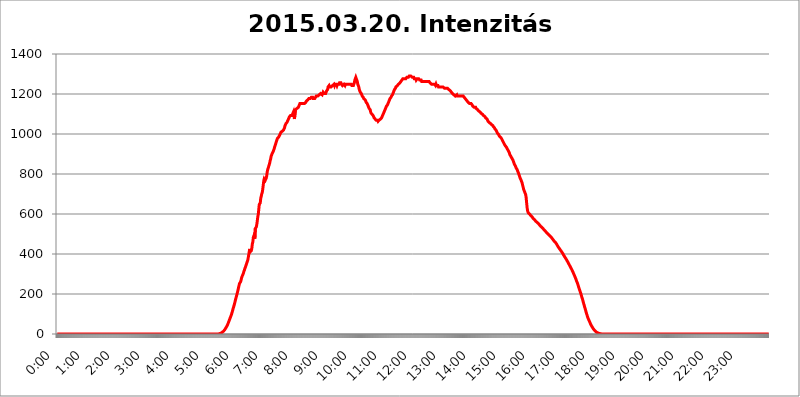
| Category | 2015.03.20. Intenzitás [W/m^2] |
|---|---|
| 0.0 | -0.256 |
| 0.0006944444444444445 | -0.256 |
| 0.001388888888888889 | -0.256 |
| 0.0020833333333333333 | -0.256 |
| 0.002777777777777778 | -0.256 |
| 0.003472222222222222 | -0.256 |
| 0.004166666666666667 | -0.256 |
| 0.004861111111111111 | -0.256 |
| 0.005555555555555556 | -0.256 |
| 0.0062499999999999995 | -0.256 |
| 0.006944444444444444 | -0.256 |
| 0.007638888888888889 | -0.256 |
| 0.008333333333333333 | -0.256 |
| 0.009027777777777779 | -0.256 |
| 0.009722222222222222 | -0.256 |
| 0.010416666666666666 | -0.256 |
| 0.011111111111111112 | -0.256 |
| 0.011805555555555555 | -0.256 |
| 0.012499999999999999 | -0.256 |
| 0.013194444444444444 | -0.256 |
| 0.013888888888888888 | -0.256 |
| 0.014583333333333332 | -0.256 |
| 0.015277777777777777 | -0.256 |
| 0.015972222222222224 | -0.256 |
| 0.016666666666666666 | -0.256 |
| 0.017361111111111112 | -0.256 |
| 0.018055555555555557 | -0.256 |
| 0.01875 | -0.256 |
| 0.019444444444444445 | -0.256 |
| 0.02013888888888889 | -0.256 |
| 0.020833333333333332 | -0.256 |
| 0.02152777777777778 | -0.256 |
| 0.022222222222222223 | -0.256 |
| 0.02291666666666667 | -0.256 |
| 0.02361111111111111 | -0.256 |
| 0.024305555555555556 | -0.256 |
| 0.024999999999999998 | -0.256 |
| 0.025694444444444447 | -0.256 |
| 0.02638888888888889 | -0.256 |
| 0.027083333333333334 | -0.256 |
| 0.027777777777777776 | -0.256 |
| 0.02847222222222222 | -0.256 |
| 0.029166666666666664 | -0.256 |
| 0.029861111111111113 | -0.256 |
| 0.030555555555555555 | -0.256 |
| 0.03125 | -0.256 |
| 0.03194444444444445 | -0.256 |
| 0.03263888888888889 | -0.256 |
| 0.03333333333333333 | -0.256 |
| 0.034027777777777775 | -0.256 |
| 0.034722222222222224 | -0.256 |
| 0.035416666666666666 | -0.256 |
| 0.036111111111111115 | -0.256 |
| 0.03680555555555556 | -0.256 |
| 0.0375 | -0.256 |
| 0.03819444444444444 | -0.256 |
| 0.03888888888888889 | -0.256 |
| 0.03958333333333333 | -0.256 |
| 0.04027777777777778 | -0.256 |
| 0.04097222222222222 | -0.256 |
| 0.041666666666666664 | -0.256 |
| 0.042361111111111106 | -0.256 |
| 0.04305555555555556 | -0.256 |
| 0.043750000000000004 | -0.256 |
| 0.044444444444444446 | -0.256 |
| 0.04513888888888889 | -0.256 |
| 0.04583333333333334 | -0.256 |
| 0.04652777777777778 | -0.256 |
| 0.04722222222222222 | -0.256 |
| 0.04791666666666666 | -0.256 |
| 0.04861111111111111 | -0.256 |
| 0.049305555555555554 | -0.256 |
| 0.049999999999999996 | -0.256 |
| 0.05069444444444445 | -0.256 |
| 0.051388888888888894 | -0.256 |
| 0.052083333333333336 | -0.256 |
| 0.05277777777777778 | -0.256 |
| 0.05347222222222222 | -0.256 |
| 0.05416666666666667 | -0.256 |
| 0.05486111111111111 | -0.256 |
| 0.05555555555555555 | -0.256 |
| 0.05625 | -0.256 |
| 0.05694444444444444 | -0.256 |
| 0.057638888888888885 | -0.256 |
| 0.05833333333333333 | -0.256 |
| 0.05902777777777778 | -0.256 |
| 0.059722222222222225 | -0.256 |
| 0.06041666666666667 | -0.256 |
| 0.061111111111111116 | -0.256 |
| 0.06180555555555556 | -0.256 |
| 0.0625 | -0.256 |
| 0.06319444444444444 | -0.256 |
| 0.06388888888888888 | -0.256 |
| 0.06458333333333334 | -0.256 |
| 0.06527777777777778 | -0.256 |
| 0.06597222222222222 | -0.256 |
| 0.06666666666666667 | -0.256 |
| 0.06736111111111111 | -0.256 |
| 0.06805555555555555 | -0.256 |
| 0.06874999999999999 | -0.256 |
| 0.06944444444444443 | -0.256 |
| 0.07013888888888889 | -0.256 |
| 0.07083333333333333 | -0.256 |
| 0.07152777777777779 | -0.256 |
| 0.07222222222222223 | -0.256 |
| 0.07291666666666667 | -0.256 |
| 0.07361111111111111 | -0.256 |
| 0.07430555555555556 | -0.256 |
| 0.075 | -0.256 |
| 0.07569444444444444 | -0.256 |
| 0.0763888888888889 | -0.256 |
| 0.07708333333333334 | -0.256 |
| 0.07777777777777778 | -0.256 |
| 0.07847222222222222 | -0.256 |
| 0.07916666666666666 | -0.256 |
| 0.0798611111111111 | -0.256 |
| 0.08055555555555556 | -0.256 |
| 0.08125 | -0.256 |
| 0.08194444444444444 | -0.256 |
| 0.08263888888888889 | -0.256 |
| 0.08333333333333333 | -0.256 |
| 0.08402777777777777 | -0.256 |
| 0.08472222222222221 | -0.256 |
| 0.08541666666666665 | -0.256 |
| 0.08611111111111112 | -0.256 |
| 0.08680555555555557 | -0.256 |
| 0.08750000000000001 | -0.256 |
| 0.08819444444444445 | -0.256 |
| 0.08888888888888889 | -0.256 |
| 0.08958333333333333 | -0.256 |
| 0.09027777777777778 | -0.256 |
| 0.09097222222222222 | -0.256 |
| 0.09166666666666667 | -0.256 |
| 0.09236111111111112 | -0.256 |
| 0.09305555555555556 | -0.256 |
| 0.09375 | -0.256 |
| 0.09444444444444444 | -0.256 |
| 0.09513888888888888 | -0.256 |
| 0.09583333333333333 | -0.256 |
| 0.09652777777777777 | -0.256 |
| 0.09722222222222222 | -0.256 |
| 0.09791666666666667 | -0.256 |
| 0.09861111111111111 | -0.256 |
| 0.09930555555555555 | -0.256 |
| 0.09999999999999999 | -0.256 |
| 0.10069444444444443 | -0.256 |
| 0.1013888888888889 | -0.256 |
| 0.10208333333333335 | -0.256 |
| 0.10277777777777779 | -0.256 |
| 0.10347222222222223 | -0.256 |
| 0.10416666666666667 | -0.256 |
| 0.10486111111111111 | -0.256 |
| 0.10555555555555556 | -0.256 |
| 0.10625 | -0.256 |
| 0.10694444444444444 | -0.256 |
| 0.1076388888888889 | -0.256 |
| 0.10833333333333334 | -0.256 |
| 0.10902777777777778 | -0.256 |
| 0.10972222222222222 | -0.256 |
| 0.1111111111111111 | -0.256 |
| 0.11180555555555556 | -0.256 |
| 0.11180555555555556 | -0.256 |
| 0.1125 | -0.256 |
| 0.11319444444444444 | -0.256 |
| 0.11388888888888889 | -0.256 |
| 0.11458333333333333 | -0.256 |
| 0.11527777777777777 | -0.256 |
| 0.11597222222222221 | -0.256 |
| 0.11666666666666665 | -0.256 |
| 0.1173611111111111 | -0.256 |
| 0.11805555555555557 | -0.256 |
| 0.11944444444444445 | -0.256 |
| 0.12013888888888889 | -0.256 |
| 0.12083333333333333 | -0.256 |
| 0.12152777777777778 | -0.256 |
| 0.12222222222222223 | -0.256 |
| 0.12291666666666667 | -0.256 |
| 0.12291666666666667 | -0.256 |
| 0.12361111111111112 | -0.256 |
| 0.12430555555555556 | -0.256 |
| 0.125 | -0.256 |
| 0.12569444444444444 | -0.256 |
| 0.12638888888888888 | -0.256 |
| 0.12708333333333333 | -0.256 |
| 0.16875 | -0.256 |
| 0.12847222222222224 | -0.256 |
| 0.12916666666666668 | -0.256 |
| 0.12986111111111112 | -0.256 |
| 0.13055555555555556 | -0.256 |
| 0.13125 | -0.256 |
| 0.13194444444444445 | -0.256 |
| 0.1326388888888889 | -0.256 |
| 0.13333333333333333 | -0.256 |
| 0.13402777777777777 | -0.256 |
| 0.13402777777777777 | -0.256 |
| 0.13472222222222222 | -0.256 |
| 0.13541666666666666 | -0.256 |
| 0.1361111111111111 | -0.256 |
| 0.13749999999999998 | -0.256 |
| 0.13819444444444443 | -0.256 |
| 0.1388888888888889 | -0.256 |
| 0.13958333333333334 | -0.256 |
| 0.14027777777777778 | -0.256 |
| 0.14097222222222222 | -0.256 |
| 0.14166666666666666 | -0.256 |
| 0.1423611111111111 | -0.256 |
| 0.14305555555555557 | -0.256 |
| 0.14375000000000002 | -0.256 |
| 0.14444444444444446 | -0.256 |
| 0.1451388888888889 | -0.256 |
| 0.1451388888888889 | -0.256 |
| 0.14652777777777778 | -0.256 |
| 0.14722222222222223 | -0.256 |
| 0.14791666666666667 | -0.256 |
| 0.1486111111111111 | -0.256 |
| 0.14930555555555555 | -0.256 |
| 0.15 | -0.256 |
| 0.15069444444444444 | -0.256 |
| 0.15138888888888888 | -0.256 |
| 0.15208333333333332 | -0.256 |
| 0.15277777777777776 | -0.256 |
| 0.15347222222222223 | -0.256 |
| 0.15416666666666667 | -0.256 |
| 0.15486111111111112 | -0.256 |
| 0.15555555555555556 | -0.256 |
| 0.15625 | -0.256 |
| 0.15694444444444444 | -0.256 |
| 0.15763888888888888 | -0.256 |
| 0.15833333333333333 | -0.256 |
| 0.15902777777777777 | -0.256 |
| 0.15972222222222224 | -0.256 |
| 0.16041666666666668 | -0.256 |
| 0.16111111111111112 | -0.256 |
| 0.16180555555555556 | -0.256 |
| 0.1625 | -0.256 |
| 0.16319444444444445 | -0.256 |
| 0.1638888888888889 | -0.256 |
| 0.16458333333333333 | -0.256 |
| 0.16527777777777777 | -0.256 |
| 0.16597222222222222 | -0.256 |
| 0.16666666666666666 | -0.256 |
| 0.1673611111111111 | -0.256 |
| 0.16805555555555554 | -0.256 |
| 0.16874999999999998 | -0.256 |
| 0.16944444444444443 | -0.256 |
| 0.17013888888888887 | -0.256 |
| 0.1708333333333333 | -0.256 |
| 0.17152777777777775 | -0.256 |
| 0.17222222222222225 | -0.256 |
| 0.1729166666666667 | -0.256 |
| 0.17361111111111113 | -0.256 |
| 0.17430555555555557 | -0.256 |
| 0.17500000000000002 | -0.256 |
| 0.17569444444444446 | -0.256 |
| 0.1763888888888889 | -0.256 |
| 0.17708333333333334 | -0.256 |
| 0.17777777777777778 | -0.256 |
| 0.17847222222222223 | -0.256 |
| 0.17916666666666667 | -0.256 |
| 0.1798611111111111 | -0.256 |
| 0.18055555555555555 | -0.256 |
| 0.18125 | -0.256 |
| 0.18194444444444444 | -0.256 |
| 0.1826388888888889 | -0.256 |
| 0.18333333333333335 | -0.256 |
| 0.1840277777777778 | -0.256 |
| 0.18472222222222223 | -0.256 |
| 0.18541666666666667 | -0.256 |
| 0.18611111111111112 | -0.256 |
| 0.18680555555555556 | -0.256 |
| 0.1875 | -0.256 |
| 0.18819444444444444 | -0.256 |
| 0.18888888888888888 | -0.256 |
| 0.18958333333333333 | -0.256 |
| 0.19027777777777777 | -0.256 |
| 0.1909722222222222 | -0.256 |
| 0.19166666666666665 | -0.256 |
| 0.19236111111111112 | -0.256 |
| 0.19305555555555554 | -0.256 |
| 0.19375 | -0.256 |
| 0.19444444444444445 | -0.256 |
| 0.1951388888888889 | -0.256 |
| 0.19583333333333333 | -0.256 |
| 0.19652777777777777 | -0.256 |
| 0.19722222222222222 | -0.256 |
| 0.19791666666666666 | -0.256 |
| 0.1986111111111111 | -0.256 |
| 0.19930555555555554 | -0.256 |
| 0.19999999999999998 | -0.256 |
| 0.20069444444444443 | -0.256 |
| 0.20138888888888887 | -0.256 |
| 0.2020833333333333 | -0.256 |
| 0.2027777777777778 | -0.256 |
| 0.2034722222222222 | -0.256 |
| 0.2041666666666667 | -0.256 |
| 0.20486111111111113 | -0.256 |
| 0.20555555555555557 | -0.256 |
| 0.20625000000000002 | -0.256 |
| 0.20694444444444446 | -0.256 |
| 0.2076388888888889 | -0.256 |
| 0.20833333333333334 | -0.256 |
| 0.20902777777777778 | -0.256 |
| 0.20972222222222223 | -0.256 |
| 0.21041666666666667 | -0.256 |
| 0.2111111111111111 | -0.256 |
| 0.21180555555555555 | -0.256 |
| 0.2125 | -0.256 |
| 0.21319444444444444 | -0.256 |
| 0.2138888888888889 | -0.256 |
| 0.21458333333333335 | -0.256 |
| 0.2152777777777778 | -0.256 |
| 0.21597222222222223 | -0.256 |
| 0.21666666666666667 | -0.256 |
| 0.21736111111111112 | -0.256 |
| 0.21805555555555556 | -0.256 |
| 0.21875 | -0.256 |
| 0.21944444444444444 | -0.256 |
| 0.22013888888888888 | -0.256 |
| 0.22083333333333333 | -0.256 |
| 0.22152777777777777 | -0.256 |
| 0.2222222222222222 | -0.256 |
| 0.22291666666666665 | -0.256 |
| 0.2236111111111111 | -0.256 |
| 0.22430555555555556 | -0.256 |
| 0.225 | -0.256 |
| 0.22569444444444445 | 1.09 |
| 0.2263888888888889 | 1.09 |
| 0.22708333333333333 | 1.09 |
| 0.22777777777777777 | 2.439 |
| 0.22847222222222222 | 3.791 |
| 0.22916666666666666 | 3.791 |
| 0.2298611111111111 | 5.146 |
| 0.23055555555555554 | 6.503 |
| 0.23124999999999998 | 7.862 |
| 0.23194444444444443 | 10.589 |
| 0.23263888888888887 | 11.956 |
| 0.2333333333333333 | 14.696 |
| 0.2340277777777778 | 17.444 |
| 0.2347222222222222 | 20.201 |
| 0.2354166666666667 | 24.35 |
| 0.23611111111111113 | 28.514 |
| 0.23680555555555557 | 31.297 |
| 0.23750000000000002 | 36.881 |
| 0.23819444444444446 | 41.081 |
| 0.2388888888888889 | 46.695 |
| 0.23958333333333334 | 52.322 |
| 0.24027777777777778 | 59.368 |
| 0.24097222222222223 | 65.012 |
| 0.24166666666666667 | 72.069 |
| 0.2423611111111111 | 79.125 |
| 0.24305555555555555 | 84.766 |
| 0.24375 | 91.806 |
| 0.24444444444444446 | 98.83 |
| 0.24513888888888888 | 107.232 |
| 0.24583333333333335 | 115.598 |
| 0.2465277777777778 | 125.304 |
| 0.24722222222222223 | 133.57 |
| 0.24791666666666667 | 141.782 |
| 0.24861111111111112 | 151.286 |
| 0.24930555555555556 | 160.704 |
| 0.25 | 171.353 |
| 0.25069444444444444 | 180.569 |
| 0.2513888888888889 | 189.685 |
| 0.2520833333333333 | 198.701 |
| 0.25277777777777777 | 208.881 |
| 0.2534722222222222 | 218.93 |
| 0.25416666666666665 | 230.083 |
| 0.2548611111111111 | 241.083 |
| 0.2555555555555556 | 251.939 |
| 0.25625000000000003 | 256.722 |
| 0.2569444444444445 | 260.293 |
| 0.2576388888888889 | 266.216 |
| 0.25833333333333336 | 277.967 |
| 0.2590277777777778 | 286.13 |
| 0.25972222222222224 | 291.937 |
| 0.2604166666666667 | 297.728 |
| 0.2611111111111111 | 304.664 |
| 0.26180555555555557 | 312.749 |
| 0.2625 | 319.683 |
| 0.26319444444444445 | 327.793 |
| 0.2638888888888889 | 333.608 |
| 0.26458333333333334 | 341.794 |
| 0.2652777777777778 | 348.865 |
| 0.2659722222222222 | 355.999 |
| 0.26666666666666666 | 363.212 |
| 0.2673611111111111 | 371.742 |
| 0.26805555555555555 | 385.455 |
| 0.26875 | 399.628 |
| 0.26944444444444443 | 415.735 |
| 0.2701388888888889 | 425.497 |
| 0.2708333333333333 | 411.638 |
| 0.27152777777777776 | 408.934 |
| 0.2722222222222222 | 417.112 |
| 0.27291666666666664 | 428.341 |
| 0.2736111111111111 | 450.542 |
| 0.2743055555555555 | 459.898 |
| 0.27499999999999997 | 482.945 |
| 0.27569444444444446 | 489.873 |
| 0.27638888888888885 | 484.662 |
| 0.27708333333333335 | 476.176 |
| 0.2777777777777778 | 527.122 |
| 0.27847222222222223 | 523.186 |
| 0.2791666666666667 | 535.145 |
| 0.2798611111111111 | 547.572 |
| 0.28055555555555556 | 564.917 |
| 0.28125 | 585.562 |
| 0.28194444444444444 | 597.582 |
| 0.2826388888888889 | 622.881 |
| 0.2833333333333333 | 647.179 |
| 0.28402777777777777 | 647.179 |
| 0.2847222222222222 | 655.618 |
| 0.28541666666666665 | 678.997 |
| 0.28611111111111115 | 688.102 |
| 0.28680555555555554 | 700.54 |
| 0.28750000000000003 | 706.89 |
| 0.2881944444444445 | 723.153 |
| 0.2888888888888889 | 743.425 |
| 0.28958333333333336 | 764.555 |
| 0.2902777777777778 | 775.451 |
| 0.29097222222222224 | 775.451 |
| 0.2916666666666667 | 768.162 |
| 0.2923611111111111 | 771.794 |
| 0.29305555555555557 | 779.134 |
| 0.29375 | 790.334 |
| 0.29444444444444445 | 809.522 |
| 0.2951388888888889 | 821.353 |
| 0.29583333333333334 | 829.377 |
| 0.2965277777777778 | 837.51 |
| 0.2972222222222222 | 841.619 |
| 0.29791666666666666 | 854.113 |
| 0.2986111111111111 | 866.865 |
| 0.29930555555555555 | 875.511 |
| 0.3 | 888.701 |
| 0.30069444444444443 | 893.157 |
| 0.3013888888888889 | 902.16 |
| 0.3020833333333333 | 902.16 |
| 0.30277777777777776 | 911.285 |
| 0.3034722222222222 | 915.893 |
| 0.30416666666666664 | 925.203 |
| 0.3048611111111111 | 934.639 |
| 0.3055555555555555 | 939.404 |
| 0.30624999999999997 | 949.03 |
| 0.3069444444444444 | 958.785 |
| 0.3076388888888889 | 963.712 |
| 0.30833333333333335 | 973.663 |
| 0.3090277777777778 | 978.688 |
| 0.30972222222222223 | 978.688 |
| 0.3104166666666667 | 983.747 |
| 0.3111111111111111 | 988.839 |
| 0.31180555555555556 | 993.965 |
| 0.3125 | 999.125 |
| 0.31319444444444444 | 1004.318 |
| 0.3138888888888889 | 1009.546 |
| 0.3145833333333333 | 1009.546 |
| 0.31527777777777777 | 1009.546 |
| 0.3159722222222222 | 1014.809 |
| 0.31666666666666665 | 1014.809 |
| 0.31736111111111115 | 1020.106 |
| 0.31805555555555554 | 1025.437 |
| 0.31875000000000003 | 1030.804 |
| 0.3194444444444445 | 1041.644 |
| 0.3201388888888889 | 1047.117 |
| 0.32083333333333336 | 1052.625 |
| 0.3215277777777778 | 1052.625 |
| 0.32222222222222224 | 1058.17 |
| 0.3229166666666667 | 1058.17 |
| 0.3236111111111111 | 1069.368 |
| 0.32430555555555557 | 1075.021 |
| 0.325 | 1075.021 |
| 0.32569444444444445 | 1086.439 |
| 0.3263888888888889 | 1086.439 |
| 0.32708333333333334 | 1092.203 |
| 0.3277777777777778 | 1092.203 |
| 0.3284722222222222 | 1092.203 |
| 0.32916666666666666 | 1092.203 |
| 0.3298611111111111 | 1098.004 |
| 0.33055555555555555 | 1098.004 |
| 0.33125 | 1109.72 |
| 0.33194444444444443 | 1109.72 |
| 0.3326388888888889 | 1075.021 |
| 0.3333333333333333 | 1075.021 |
| 0.3340277777777778 | 1121.587 |
| 0.3347222222222222 | 1121.587 |
| 0.3354166666666667 | 1121.587 |
| 0.3361111111111111 | 1127.578 |
| 0.3368055555555556 | 1127.578 |
| 0.33749999999999997 | 1127.578 |
| 0.33819444444444446 | 1133.607 |
| 0.33888888888888885 | 1139.675 |
| 0.33958333333333335 | 1145.782 |
| 0.34027777777777773 | 1151.928 |
| 0.34097222222222223 | 1151.928 |
| 0.3416666666666666 | 1151.928 |
| 0.3423611111111111 | 1151.928 |
| 0.3430555555555555 | 1151.928 |
| 0.34375 | 1151.928 |
| 0.3444444444444445 | 1151.928 |
| 0.3451388888888889 | 1151.928 |
| 0.3458333333333334 | 1151.928 |
| 0.34652777777777777 | 1151.928 |
| 0.34722222222222227 | 1151.928 |
| 0.34791666666666665 | 1151.928 |
| 0.34861111111111115 | 1158.113 |
| 0.34930555555555554 | 1164.337 |
| 0.35000000000000003 | 1164.337 |
| 0.3506944444444444 | 1164.337 |
| 0.3513888888888889 | 1170.601 |
| 0.3520833333333333 | 1170.601 |
| 0.3527777777777778 | 1176.905 |
| 0.3534722222222222 | 1176.905 |
| 0.3541666666666667 | 1176.905 |
| 0.3548611111111111 | 1176.905 |
| 0.35555555555555557 | 1176.905 |
| 0.35625 | 1183.249 |
| 0.35694444444444445 | 1183.249 |
| 0.3576388888888889 | 1183.249 |
| 0.35833333333333334 | 1183.249 |
| 0.3590277777777778 | 1176.905 |
| 0.3597222222222222 | 1176.905 |
| 0.36041666666666666 | 1176.905 |
| 0.3611111111111111 | 1176.905 |
| 0.36180555555555555 | 1176.905 |
| 0.3625 | 1176.905 |
| 0.36319444444444443 | 1189.633 |
| 0.3638888888888889 | 1189.633 |
| 0.3645833333333333 | 1189.633 |
| 0.3652777777777778 | 1189.633 |
| 0.3659722222222222 | 1189.633 |
| 0.3666666666666667 | 1189.633 |
| 0.3673611111111111 | 1196.058 |
| 0.3680555555555556 | 1196.058 |
| 0.36874999999999997 | 1196.058 |
| 0.36944444444444446 | 1202.523 |
| 0.37013888888888885 | 1202.523 |
| 0.37083333333333335 | 1202.523 |
| 0.37152777777777773 | 1196.058 |
| 0.37222222222222223 | 1202.523 |
| 0.3729166666666666 | 1209.029 |
| 0.3736111111111111 | 1209.029 |
| 0.3743055555555555 | 1202.523 |
| 0.375 | 1202.523 |
| 0.3756944444444445 | 1202.523 |
| 0.3763888888888889 | 1202.523 |
| 0.3770833333333334 | 1209.029 |
| 0.37777777777777777 | 1215.576 |
| 0.37847222222222227 | 1215.576 |
| 0.37916666666666665 | 1222.164 |
| 0.37986111111111115 | 1235.465 |
| 0.38055555555555554 | 1235.465 |
| 0.38125000000000003 | 1242.179 |
| 0.3819444444444444 | 1235.465 |
| 0.3826388888888889 | 1235.465 |
| 0.3833333333333333 | 1235.465 |
| 0.3840277777777778 | 1235.465 |
| 0.3847222222222222 | 1235.465 |
| 0.3854166666666667 | 1235.465 |
| 0.3861111111111111 | 1242.179 |
| 0.38680555555555557 | 1242.179 |
| 0.3875 | 1242.179 |
| 0.38819444444444445 | 1248.934 |
| 0.3888888888888889 | 1242.179 |
| 0.38958333333333334 | 1248.934 |
| 0.3902777777777778 | 1248.934 |
| 0.3909722222222222 | 1248.934 |
| 0.39166666666666666 | 1248.934 |
| 0.3923611111111111 | 1242.179 |
| 0.39305555555555555 | 1248.934 |
| 0.39375 | 1248.934 |
| 0.39444444444444443 | 1248.934 |
| 0.3951388888888889 | 1248.934 |
| 0.3958333333333333 | 1255.731 |
| 0.3965277777777778 | 1255.731 |
| 0.3972222222222222 | 1255.731 |
| 0.3979166666666667 | 1255.731 |
| 0.3986111111111111 | 1248.934 |
| 0.3993055555555556 | 1248.934 |
| 0.39999999999999997 | 1242.179 |
| 0.40069444444444446 | 1242.179 |
| 0.40138888888888885 | 1242.179 |
| 0.40208333333333335 | 1248.934 |
| 0.40277777777777773 | 1248.934 |
| 0.40347222222222223 | 1242.179 |
| 0.4041666666666666 | 1248.934 |
| 0.4048611111111111 | 1248.934 |
| 0.4055555555555555 | 1248.934 |
| 0.40625 | 1248.934 |
| 0.4069444444444445 | 1248.934 |
| 0.4076388888888889 | 1248.934 |
| 0.4083333333333334 | 1248.934 |
| 0.40902777777777777 | 1248.934 |
| 0.40972222222222227 | 1248.934 |
| 0.41041666666666665 | 1248.934 |
| 0.41111111111111115 | 1248.934 |
| 0.41180555555555554 | 1248.934 |
| 0.41250000000000003 | 1248.934 |
| 0.4131944444444444 | 1242.179 |
| 0.4138888888888889 | 1242.179 |
| 0.4145833333333333 | 1242.179 |
| 0.4152777777777778 | 1242.179 |
| 0.4159722222222222 | 1248.934 |
| 0.4166666666666667 | 1255.731 |
| 0.4173611111111111 | 1269.454 |
| 0.41805555555555557 | 1276.38 |
| 0.41875 | 1283.348 |
| 0.41944444444444445 | 1283.348 |
| 0.4201388888888889 | 1269.454 |
| 0.42083333333333334 | 1262.571 |
| 0.4215277777777778 | 1248.934 |
| 0.4222222222222222 | 1242.179 |
| 0.42291666666666666 | 1235.465 |
| 0.4236111111111111 | 1222.164 |
| 0.42430555555555555 | 1222.164 |
| 0.425 | 1209.029 |
| 0.42569444444444443 | 1209.029 |
| 0.4263888888888889 | 1202.523 |
| 0.4270833333333333 | 1196.058 |
| 0.4277777777777778 | 1189.633 |
| 0.4284722222222222 | 1189.633 |
| 0.4291666666666667 | 1183.249 |
| 0.4298611111111111 | 1176.905 |
| 0.4305555555555556 | 1176.905 |
| 0.43124999999999997 | 1176.905 |
| 0.43194444444444446 | 1170.601 |
| 0.43263888888888885 | 1164.337 |
| 0.43333333333333335 | 1158.113 |
| 0.43402777777777773 | 1158.113 |
| 0.43472222222222223 | 1151.928 |
| 0.4354166666666666 | 1145.782 |
| 0.4361111111111111 | 1139.675 |
| 0.4368055555555555 | 1139.675 |
| 0.4375 | 1127.578 |
| 0.4381944444444445 | 1127.578 |
| 0.4388888888888889 | 1121.587 |
| 0.4395833333333334 | 1109.72 |
| 0.44027777777777777 | 1103.843 |
| 0.44097222222222227 | 1103.843 |
| 0.44166666666666665 | 1098.004 |
| 0.44236111111111115 | 1098.004 |
| 0.44305555555555554 | 1092.203 |
| 0.44375000000000003 | 1086.439 |
| 0.4444444444444444 | 1080.711 |
| 0.4451388888888889 | 1080.711 |
| 0.4458333333333333 | 1075.021 |
| 0.4465277777777778 | 1075.021 |
| 0.4472222222222222 | 1069.368 |
| 0.4479166666666667 | 1069.368 |
| 0.4486111111111111 | 1069.368 |
| 0.44930555555555557 | 1069.368 |
| 0.45 | 1063.751 |
| 0.45069444444444445 | 1063.751 |
| 0.4513888888888889 | 1069.368 |
| 0.45208333333333334 | 1069.368 |
| 0.4527777777777778 | 1069.368 |
| 0.4534722222222222 | 1075.021 |
| 0.45416666666666666 | 1075.021 |
| 0.4548611111111111 | 1080.711 |
| 0.45555555555555555 | 1086.439 |
| 0.45625 | 1092.203 |
| 0.45694444444444443 | 1098.004 |
| 0.4576388888888889 | 1103.843 |
| 0.4583333333333333 | 1109.72 |
| 0.4590277777777778 | 1115.634 |
| 0.4597222222222222 | 1121.587 |
| 0.4604166666666667 | 1127.578 |
| 0.4611111111111111 | 1133.607 |
| 0.4618055555555556 | 1139.675 |
| 0.46249999999999997 | 1139.675 |
| 0.46319444444444446 | 1145.782 |
| 0.46388888888888885 | 1151.928 |
| 0.46458333333333335 | 1158.113 |
| 0.46527777777777773 | 1164.337 |
| 0.46597222222222223 | 1170.601 |
| 0.4666666666666666 | 1176.905 |
| 0.4673611111111111 | 1176.905 |
| 0.4680555555555555 | 1183.249 |
| 0.46875 | 1189.633 |
| 0.4694444444444445 | 1189.633 |
| 0.4701388888888889 | 1196.058 |
| 0.4708333333333334 | 1202.523 |
| 0.47152777777777777 | 1209.029 |
| 0.47222222222222227 | 1215.576 |
| 0.47291666666666665 | 1222.164 |
| 0.47361111111111115 | 1222.164 |
| 0.47430555555555554 | 1228.794 |
| 0.47500000000000003 | 1235.465 |
| 0.4756944444444444 | 1235.465 |
| 0.4763888888888889 | 1235.465 |
| 0.4770833333333333 | 1242.179 |
| 0.4777777777777778 | 1242.179 |
| 0.4784722222222222 | 1248.934 |
| 0.4791666666666667 | 1248.934 |
| 0.4798611111111111 | 1248.934 |
| 0.48055555555555557 | 1255.731 |
| 0.48125 | 1255.731 |
| 0.48194444444444445 | 1262.571 |
| 0.4826388888888889 | 1262.571 |
| 0.48333333333333334 | 1269.454 |
| 0.4840277777777778 | 1269.454 |
| 0.4847222222222222 | 1276.38 |
| 0.48541666666666666 | 1276.38 |
| 0.4861111111111111 | 1276.38 |
| 0.48680555555555555 | 1276.38 |
| 0.4875 | 1276.38 |
| 0.48819444444444443 | 1276.38 |
| 0.4888888888888889 | 1276.38 |
| 0.4895833333333333 | 1276.38 |
| 0.4902777777777778 | 1283.348 |
| 0.4909722222222222 | 1283.348 |
| 0.4916666666666667 | 1283.348 |
| 0.4923611111111111 | 1283.348 |
| 0.4930555555555556 | 1283.348 |
| 0.49374999999999997 | 1290.36 |
| 0.49444444444444446 | 1290.36 |
| 0.49513888888888885 | 1290.36 |
| 0.49583333333333335 | 1290.36 |
| 0.49652777777777773 | 1290.36 |
| 0.49722222222222223 | 1290.36 |
| 0.4979166666666666 | 1283.348 |
| 0.4986111111111111 | 1283.348 |
| 0.4993055555555555 | 1283.348 |
| 0.5 | 1283.348 |
| 0.5006944444444444 | 1276.38 |
| 0.5013888888888889 | 1276.38 |
| 0.5020833333333333 | 1276.38 |
| 0.5027777777777778 | 1276.38 |
| 0.5034722222222222 | 1269.454 |
| 0.5041666666666667 | 1269.454 |
| 0.5048611111111111 | 1276.38 |
| 0.5055555555555555 | 1276.38 |
| 0.50625 | 1276.38 |
| 0.5069444444444444 | 1276.38 |
| 0.5076388888888889 | 1276.38 |
| 0.5083333333333333 | 1269.454 |
| 0.5090277777777777 | 1269.454 |
| 0.5097222222222222 | 1269.454 |
| 0.5104166666666666 | 1269.454 |
| 0.5111111111111112 | 1262.571 |
| 0.5118055555555555 | 1262.571 |
| 0.5125000000000001 | 1262.571 |
| 0.5131944444444444 | 1262.571 |
| 0.513888888888889 | 1262.571 |
| 0.5145833333333333 | 1262.571 |
| 0.5152777777777778 | 1262.571 |
| 0.5159722222222222 | 1262.571 |
| 0.5166666666666667 | 1262.571 |
| 0.517361111111111 | 1262.571 |
| 0.5180555555555556 | 1262.571 |
| 0.5187499999999999 | 1262.571 |
| 0.5194444444444445 | 1262.571 |
| 0.5201388888888888 | 1262.571 |
| 0.5208333333333334 | 1262.571 |
| 0.5215277777777778 | 1262.571 |
| 0.5222222222222223 | 1262.571 |
| 0.5229166666666667 | 1255.731 |
| 0.5236111111111111 | 1255.731 |
| 0.5243055555555556 | 1255.731 |
| 0.525 | 1248.934 |
| 0.5256944444444445 | 1248.934 |
| 0.5263888888888889 | 1248.934 |
| 0.5270833333333333 | 1248.934 |
| 0.5277777777777778 | 1248.934 |
| 0.5284722222222222 | 1248.934 |
| 0.5291666666666667 | 1248.934 |
| 0.5298611111111111 | 1248.934 |
| 0.5305555555555556 | 1242.179 |
| 0.53125 | 1248.934 |
| 0.5319444444444444 | 1242.179 |
| 0.5326388888888889 | 1242.179 |
| 0.5333333333333333 | 1242.179 |
| 0.5340277777777778 | 1242.179 |
| 0.5347222222222222 | 1235.465 |
| 0.5354166666666667 | 1235.465 |
| 0.5361111111111111 | 1235.465 |
| 0.5368055555555555 | 1235.465 |
| 0.5375 | 1235.465 |
| 0.5381944444444444 | 1235.465 |
| 0.5388888888888889 | 1235.465 |
| 0.5395833333333333 | 1235.465 |
| 0.5402777777777777 | 1235.465 |
| 0.5409722222222222 | 1235.465 |
| 0.5416666666666666 | 1235.465 |
| 0.5423611111111112 | 1235.465 |
| 0.5430555555555555 | 1228.794 |
| 0.5437500000000001 | 1228.794 |
| 0.5444444444444444 | 1228.794 |
| 0.545138888888889 | 1228.794 |
| 0.5458333333333333 | 1228.794 |
| 0.5465277777777778 | 1228.794 |
| 0.5472222222222222 | 1228.794 |
| 0.5479166666666667 | 1228.794 |
| 0.548611111111111 | 1228.794 |
| 0.5493055555555556 | 1222.164 |
| 0.5499999999999999 | 1222.164 |
| 0.5506944444444445 | 1222.164 |
| 0.5513888888888888 | 1215.576 |
| 0.5520833333333334 | 1215.576 |
| 0.5527777777777778 | 1209.029 |
| 0.5534722222222223 | 1209.029 |
| 0.5541666666666667 | 1202.523 |
| 0.5548611111111111 | 1202.523 |
| 0.5555555555555556 | 1202.523 |
| 0.55625 | 1196.058 |
| 0.5569444444444445 | 1196.058 |
| 0.5576388888888889 | 1196.058 |
| 0.5583333333333333 | 1189.633 |
| 0.5590277777777778 | 1189.633 |
| 0.5597222222222222 | 1189.633 |
| 0.5604166666666667 | 1196.058 |
| 0.5611111111111111 | 1189.633 |
| 0.5618055555555556 | 1189.633 |
| 0.5625 | 1189.633 |
| 0.5631944444444444 | 1189.633 |
| 0.5638888888888889 | 1189.633 |
| 0.5645833333333333 | 1189.633 |
| 0.5652777777777778 | 1189.633 |
| 0.5659722222222222 | 1189.633 |
| 0.5666666666666667 | 1189.633 |
| 0.5673611111111111 | 1189.633 |
| 0.5680555555555555 | 1189.633 |
| 0.56875 | 1189.633 |
| 0.5694444444444444 | 1189.633 |
| 0.5701388888888889 | 1189.633 |
| 0.5708333333333333 | 1183.249 |
| 0.5715277777777777 | 1183.249 |
| 0.5722222222222222 | 1176.905 |
| 0.5729166666666666 | 1176.905 |
| 0.5736111111111112 | 1170.601 |
| 0.5743055555555555 | 1170.601 |
| 0.5750000000000001 | 1164.337 |
| 0.5756944444444444 | 1164.337 |
| 0.576388888888889 | 1158.113 |
| 0.5770833333333333 | 1158.113 |
| 0.5777777777777778 | 1158.113 |
| 0.5784722222222222 | 1151.928 |
| 0.5791666666666667 | 1151.928 |
| 0.579861111111111 | 1151.928 |
| 0.5805555555555556 | 1151.928 |
| 0.5812499999999999 | 1151.928 |
| 0.5819444444444445 | 1145.782 |
| 0.5826388888888888 | 1139.675 |
| 0.5833333333333334 | 1139.675 |
| 0.5840277777777778 | 1139.675 |
| 0.5847222222222223 | 1133.607 |
| 0.5854166666666667 | 1133.607 |
| 0.5861111111111111 | 1133.607 |
| 0.5868055555555556 | 1133.607 |
| 0.5875 | 1127.578 |
| 0.5881944444444445 | 1127.578 |
| 0.5888888888888889 | 1127.578 |
| 0.5895833333333333 | 1121.587 |
| 0.5902777777777778 | 1121.587 |
| 0.5909722222222222 | 1115.634 |
| 0.5916666666666667 | 1115.634 |
| 0.5923611111111111 | 1115.634 |
| 0.5930555555555556 | 1109.72 |
| 0.59375 | 1109.72 |
| 0.5944444444444444 | 1103.843 |
| 0.5951388888888889 | 1103.843 |
| 0.5958333333333333 | 1103.843 |
| 0.5965277777777778 | 1098.004 |
| 0.5972222222222222 | 1098.004 |
| 0.5979166666666667 | 1092.203 |
| 0.5986111111111111 | 1092.203 |
| 0.5993055555555555 | 1092.203 |
| 0.6 | 1086.439 |
| 0.6006944444444444 | 1080.711 |
| 0.6013888888888889 | 1080.711 |
| 0.6020833333333333 | 1080.711 |
| 0.6027777777777777 | 1075.021 |
| 0.6034722222222222 | 1069.368 |
| 0.6041666666666666 | 1063.751 |
| 0.6048611111111112 | 1063.751 |
| 0.6055555555555555 | 1058.17 |
| 0.6062500000000001 | 1058.17 |
| 0.6069444444444444 | 1058.17 |
| 0.607638888888889 | 1052.625 |
| 0.6083333333333333 | 1052.625 |
| 0.6090277777777778 | 1047.117 |
| 0.6097222222222222 | 1047.117 |
| 0.6104166666666667 | 1047.117 |
| 0.611111111111111 | 1041.644 |
| 0.6118055555555556 | 1036.206 |
| 0.6124999999999999 | 1036.206 |
| 0.6131944444444445 | 1030.804 |
| 0.6138888888888888 | 1025.437 |
| 0.6145833333333334 | 1025.437 |
| 0.6152777777777778 | 1020.106 |
| 0.6159722222222223 | 1014.809 |
| 0.6166666666666667 | 1009.546 |
| 0.6173611111111111 | 1004.318 |
| 0.6180555555555556 | 1004.318 |
| 0.61875 | 999.125 |
| 0.6194444444444445 | 993.965 |
| 0.6201388888888889 | 988.839 |
| 0.6208333333333333 | 988.839 |
| 0.6215277777777778 | 983.747 |
| 0.6222222222222222 | 983.747 |
| 0.6229166666666667 | 978.688 |
| 0.6236111111111111 | 973.663 |
| 0.6243055555555556 | 968.671 |
| 0.625 | 963.712 |
| 0.6256944444444444 | 958.785 |
| 0.6263888888888889 | 953.892 |
| 0.6270833333333333 | 949.03 |
| 0.6277777777777778 | 944.201 |
| 0.6284722222222222 | 939.404 |
| 0.6291666666666667 | 939.404 |
| 0.6298611111111111 | 934.639 |
| 0.6305555555555555 | 929.905 |
| 0.63125 | 925.203 |
| 0.6319444444444444 | 920.533 |
| 0.6326388888888889 | 915.893 |
| 0.6333333333333333 | 911.285 |
| 0.6340277777777777 | 906.707 |
| 0.6347222222222222 | 897.643 |
| 0.6354166666666666 | 893.157 |
| 0.6361111111111112 | 888.701 |
| 0.6368055555555555 | 884.274 |
| 0.6375000000000001 | 879.878 |
| 0.6381944444444444 | 875.511 |
| 0.638888888888889 | 871.173 |
| 0.6395833333333333 | 866.865 |
| 0.6402777777777778 | 858.335 |
| 0.6409722222222222 | 849.92 |
| 0.6416666666666667 | 845.755 |
| 0.642361111111111 | 841.619 |
| 0.6430555555555556 | 837.51 |
| 0.6437499999999999 | 829.377 |
| 0.6444444444444445 | 825.351 |
| 0.6451388888888888 | 821.353 |
| 0.6458333333333334 | 813.439 |
| 0.6465277777777778 | 809.522 |
| 0.6472222222222223 | 801.768 |
| 0.6479166666666667 | 794.119 |
| 0.6486111111111111 | 786.575 |
| 0.6493055555555556 | 779.134 |
| 0.65 | 775.451 |
| 0.6506944444444445 | 768.162 |
| 0.6513888888888889 | 760.972 |
| 0.6520833333333333 | 753.881 |
| 0.6527777777777778 | 743.425 |
| 0.6534722222222222 | 733.184 |
| 0.6541666666666667 | 723.153 |
| 0.6548611111111111 | 716.58 |
| 0.6555555555555556 | 710.098 |
| 0.65625 | 703.704 |
| 0.6569444444444444 | 697.399 |
| 0.6576388888888889 | 682.011 |
| 0.6583333333333333 | 655.618 |
| 0.6590277777777778 | 630.814 |
| 0.6597222222222222 | 615.11 |
| 0.6604166666666667 | 607.495 |
| 0.6611111111111111 | 604.992 |
| 0.6618055555555555 | 602.505 |
| 0.6625 | 600.035 |
| 0.6631944444444444 | 595.145 |
| 0.6638888888888889 | 592.725 |
| 0.6645833333333333 | 590.321 |
| 0.6652777777777777 | 587.934 |
| 0.6659722222222222 | 585.562 |
| 0.6666666666666666 | 580.866 |
| 0.6673611111111111 | 578.542 |
| 0.6680555555555556 | 576.233 |
| 0.6687500000000001 | 573.939 |
| 0.6694444444444444 | 571.661 |
| 0.6701388888888888 | 569.398 |
| 0.6708333333333334 | 564.917 |
| 0.6715277777777778 | 562.699 |
| 0.6722222222222222 | 560.495 |
| 0.6729166666666666 | 558.305 |
| 0.6736111111111112 | 556.131 |
| 0.6743055555555556 | 553.97 |
| 0.6749999999999999 | 551.823 |
| 0.6756944444444444 | 547.572 |
| 0.6763888888888889 | 545.467 |
| 0.6770833333333334 | 543.376 |
| 0.6777777777777777 | 539.234 |
| 0.6784722222222223 | 537.182 |
| 0.6791666666666667 | 535.145 |
| 0.6798611111111111 | 533.12 |
| 0.6805555555555555 | 531.108 |
| 0.68125 | 527.122 |
| 0.6819444444444445 | 525.148 |
| 0.6826388888888889 | 523.186 |
| 0.6833333333333332 | 519.3 |
| 0.6840277777777778 | 517.375 |
| 0.6847222222222222 | 513.561 |
| 0.6854166666666667 | 511.671 |
| 0.686111111111111 | 507.927 |
| 0.6868055555555556 | 506.072 |
| 0.6875 | 504.229 |
| 0.6881944444444444 | 500.575 |
| 0.688888888888889 | 498.764 |
| 0.6895833333333333 | 496.965 |
| 0.6902777777777778 | 493.398 |
| 0.6909722222222222 | 489.873 |
| 0.6916666666666668 | 488.126 |
| 0.6923611111111111 | 484.662 |
| 0.6930555555555555 | 482.945 |
| 0.69375 | 479.541 |
| 0.6944444444444445 | 476.176 |
| 0.6951388888888889 | 472.848 |
| 0.6958333333333333 | 469.557 |
| 0.6965277777777777 | 466.302 |
| 0.6972222222222223 | 463.083 |
| 0.6979166666666666 | 461.486 |
| 0.6986111111111111 | 458.318 |
| 0.6993055555555556 | 455.184 |
| 0.7000000000000001 | 450.542 |
| 0.7006944444444444 | 447.487 |
| 0.7013888888888888 | 442.962 |
| 0.7020833333333334 | 438.503 |
| 0.7027777777777778 | 435.566 |
| 0.7034722222222222 | 431.211 |
| 0.7041666666666666 | 428.341 |
| 0.7048611111111112 | 424.085 |
| 0.7055555555555556 | 421.278 |
| 0.7062499999999999 | 417.112 |
| 0.7069444444444444 | 414.364 |
| 0.7076388888888889 | 410.283 |
| 0.7083333333333334 | 406.25 |
| 0.7090277777777777 | 402.262 |
| 0.7097222222222223 | 398.318 |
| 0.7104166666666667 | 393.122 |
| 0.7111111111111111 | 389.27 |
| 0.7118055555555555 | 385.455 |
| 0.7125 | 381.674 |
| 0.7131944444444445 | 377.925 |
| 0.7138888888888889 | 374.206 |
| 0.7145833333333332 | 369.291 |
| 0.7152777777777778 | 365.635 |
| 0.7159722222222222 | 360.798 |
| 0.7166666666666667 | 355.999 |
| 0.717361111111111 | 351.235 |
| 0.7180555555555556 | 346.501 |
| 0.71875 | 341.794 |
| 0.7194444444444444 | 337.109 |
| 0.720138888888889 | 332.443 |
| 0.7208333333333333 | 327.793 |
| 0.7215277777777778 | 323.156 |
| 0.7222222222222222 | 318.527 |
| 0.7229166666666668 | 312.749 |
| 0.7236111111111111 | 306.974 |
| 0.7243055555555555 | 301.198 |
| 0.725 | 295.413 |
| 0.7256944444444445 | 290.777 |
| 0.7263888888888889 | 283.803 |
| 0.7270833333333333 | 277.967 |
| 0.7277777777777777 | 270.931 |
| 0.7284722222222223 | 263.851 |
| 0.7291666666666666 | 257.913 |
| 0.7298611111111111 | 250.739 |
| 0.7305555555555556 | 243.507 |
| 0.7312500000000001 | 234.99 |
| 0.7319444444444444 | 227.618 |
| 0.7326388888888888 | 220.177 |
| 0.7333333333333334 | 212.664 |
| 0.7340277777777778 | 205.079 |
| 0.7347222222222222 | 197.419 |
| 0.7354166666666666 | 188.389 |
| 0.7361111111111112 | 180.569 |
| 0.7368055555555556 | 172.676 |
| 0.7374999999999999 | 163.378 |
| 0.7381944444444444 | 153.986 |
| 0.7388888888888889 | 145.865 |
| 0.7395833333333334 | 136.314 |
| 0.7402777777777777 | 128.065 |
| 0.7409722222222223 | 119.766 |
| 0.7416666666666667 | 110.025 |
| 0.7423611111111111 | 101.634 |
| 0.7430555555555555 | 94.617 |
| 0.74375 | 86.175 |
| 0.7444444444444445 | 79.125 |
| 0.7451388888888889 | 73.481 |
| 0.7458333333333332 | 67.835 |
| 0.7465277777777778 | 62.189 |
| 0.7472222222222222 | 56.548 |
| 0.7479166666666667 | 50.914 |
| 0.748611111111111 | 45.29 |
| 0.7493055555555556 | 41.081 |
| 0.75 | 36.881 |
| 0.7506944444444444 | 32.691 |
| 0.751388888888889 | 28.514 |
| 0.7520833333333333 | 25.736 |
| 0.7527777777777778 | 21.582 |
| 0.7534722222222222 | 18.822 |
| 0.7541666666666668 | 16.069 |
| 0.7548611111111111 | 13.325 |
| 0.7555555555555555 | 11.956 |
| 0.75625 | 9.225 |
| 0.7569444444444445 | 7.862 |
| 0.7576388888888889 | 6.503 |
| 0.7583333333333333 | 5.146 |
| 0.7590277777777777 | 3.791 |
| 0.7597222222222223 | 3.791 |
| 0.7604166666666666 | 2.439 |
| 0.7611111111111111 | 2.439 |
| 0.7618055555555556 | 1.09 |
| 0.7625000000000001 | 1.09 |
| 0.7631944444444444 | 1.09 |
| 0.7638888888888888 | -0.256 |
| 0.7645833333333334 | -0.256 |
| 0.7652777777777778 | -0.256 |
| 0.7659722222222222 | -0.256 |
| 0.7666666666666666 | -0.256 |
| 0.7673611111111112 | -0.256 |
| 0.7680555555555556 | -0.256 |
| 0.7687499999999999 | -0.256 |
| 0.7694444444444444 | -0.256 |
| 0.7701388888888889 | -0.256 |
| 0.7708333333333334 | -0.256 |
| 0.7715277777777777 | -0.256 |
| 0.7722222222222223 | -0.256 |
| 0.7729166666666667 | -0.256 |
| 0.7736111111111111 | -0.256 |
| 0.7743055555555555 | -0.256 |
| 0.775 | -0.256 |
| 0.7756944444444445 | -0.256 |
| 0.7763888888888889 | -0.256 |
| 0.7770833333333332 | -0.256 |
| 0.7777777777777778 | -0.256 |
| 0.7784722222222222 | -0.256 |
| 0.7791666666666667 | -0.256 |
| 0.779861111111111 | -0.256 |
| 0.7805555555555556 | -0.256 |
| 0.78125 | -0.256 |
| 0.7819444444444444 | -0.256 |
| 0.782638888888889 | -0.256 |
| 0.7833333333333333 | -0.256 |
| 0.7840277777777778 | -0.256 |
| 0.7847222222222222 | -0.256 |
| 0.7854166666666668 | -0.256 |
| 0.7861111111111111 | -0.256 |
| 0.7868055555555555 | -0.256 |
| 0.7875 | -0.256 |
| 0.7881944444444445 | -0.256 |
| 0.7888888888888889 | -0.256 |
| 0.7895833333333333 | -0.256 |
| 0.7902777777777777 | -0.256 |
| 0.7909722222222223 | -0.256 |
| 0.7916666666666666 | -0.256 |
| 0.7923611111111111 | -0.256 |
| 0.7930555555555556 | -0.256 |
| 0.7937500000000001 | -0.256 |
| 0.7944444444444444 | -0.256 |
| 0.7951388888888888 | -0.256 |
| 0.7958333333333334 | -0.256 |
| 0.7965277777777778 | -0.256 |
| 0.7972222222222222 | -0.256 |
| 0.7979166666666666 | -0.256 |
| 0.7986111111111112 | -0.256 |
| 0.7993055555555556 | -0.256 |
| 0.7999999999999999 | -0.256 |
| 0.8006944444444444 | -0.256 |
| 0.8013888888888889 | -0.256 |
| 0.8020833333333334 | -0.256 |
| 0.8027777777777777 | -0.256 |
| 0.8034722222222223 | -0.256 |
| 0.8041666666666667 | -0.256 |
| 0.8048611111111111 | -0.256 |
| 0.8055555555555555 | -0.256 |
| 0.80625 | -0.256 |
| 0.8069444444444445 | -0.256 |
| 0.8076388888888889 | -0.256 |
| 0.8083333333333332 | -0.256 |
| 0.8090277777777778 | -0.256 |
| 0.8097222222222222 | -0.256 |
| 0.8104166666666667 | -0.256 |
| 0.811111111111111 | -0.256 |
| 0.8118055555555556 | -0.256 |
| 0.8125 | -0.256 |
| 0.8131944444444444 | -0.256 |
| 0.813888888888889 | -0.256 |
| 0.8145833333333333 | -0.256 |
| 0.8152777777777778 | -0.256 |
| 0.8159722222222222 | -0.256 |
| 0.8166666666666668 | -0.256 |
| 0.8173611111111111 | -0.256 |
| 0.8180555555555555 | -0.256 |
| 0.81875 | -0.256 |
| 0.8194444444444445 | -0.256 |
| 0.8201388888888889 | -0.256 |
| 0.8208333333333333 | -0.256 |
| 0.8215277777777777 | -0.256 |
| 0.8222222222222223 | -0.256 |
| 0.8229166666666666 | -0.256 |
| 0.8236111111111111 | -0.256 |
| 0.8243055555555556 | -0.256 |
| 0.8250000000000001 | -0.256 |
| 0.8256944444444444 | -0.256 |
| 0.8263888888888888 | -0.256 |
| 0.8270833333333334 | -0.256 |
| 0.8277777777777778 | -0.256 |
| 0.8284722222222222 | -0.256 |
| 0.8291666666666666 | -0.256 |
| 0.8298611111111112 | -0.256 |
| 0.8305555555555556 | -0.256 |
| 0.8312499999999999 | -0.256 |
| 0.8319444444444444 | -0.256 |
| 0.8326388888888889 | -0.256 |
| 0.8333333333333334 | -0.256 |
| 0.8340277777777777 | -0.256 |
| 0.8347222222222223 | -0.256 |
| 0.8354166666666667 | -0.256 |
| 0.8361111111111111 | -0.256 |
| 0.8368055555555555 | -0.256 |
| 0.8375 | -0.256 |
| 0.8381944444444445 | -0.256 |
| 0.8388888888888889 | -0.256 |
| 0.8395833333333332 | -0.256 |
| 0.8402777777777778 | -0.256 |
| 0.8409722222222222 | -0.256 |
| 0.8416666666666667 | -0.256 |
| 0.842361111111111 | -0.256 |
| 0.8430555555555556 | -0.256 |
| 0.84375 | -0.256 |
| 0.8444444444444444 | -0.256 |
| 0.845138888888889 | -0.256 |
| 0.8458333333333333 | -0.256 |
| 0.8465277777777778 | -0.256 |
| 0.8472222222222222 | -0.256 |
| 0.8479166666666668 | -0.256 |
| 0.8486111111111111 | -0.256 |
| 0.8493055555555555 | -0.256 |
| 0.85 | -0.256 |
| 0.8506944444444445 | -0.256 |
| 0.8513888888888889 | -0.256 |
| 0.8520833333333333 | -0.256 |
| 0.8527777777777777 | -0.256 |
| 0.8534722222222223 | -0.256 |
| 0.8541666666666666 | -0.256 |
| 0.8548611111111111 | -0.256 |
| 0.8555555555555556 | -0.256 |
| 0.8562500000000001 | -0.256 |
| 0.8569444444444444 | -0.256 |
| 0.8576388888888888 | -0.256 |
| 0.8583333333333334 | -0.256 |
| 0.8590277777777778 | -0.256 |
| 0.8597222222222222 | -0.256 |
| 0.8604166666666666 | -0.256 |
| 0.8611111111111112 | -0.256 |
| 0.8618055555555556 | -0.256 |
| 0.8624999999999999 | -0.256 |
| 0.8631944444444444 | -0.256 |
| 0.8638888888888889 | -0.256 |
| 0.8645833333333334 | -0.256 |
| 0.8652777777777777 | -0.256 |
| 0.8659722222222223 | -0.256 |
| 0.8666666666666667 | -0.256 |
| 0.8673611111111111 | -0.256 |
| 0.8680555555555555 | -0.256 |
| 0.86875 | -0.256 |
| 0.8694444444444445 | -0.256 |
| 0.8701388888888889 | -0.256 |
| 0.8708333333333332 | -0.256 |
| 0.8715277777777778 | -0.256 |
| 0.8722222222222222 | -0.256 |
| 0.8729166666666667 | -0.256 |
| 0.873611111111111 | -0.256 |
| 0.8743055555555556 | -0.256 |
| 0.875 | -0.256 |
| 0.8756944444444444 | -0.256 |
| 0.876388888888889 | -0.256 |
| 0.8770833333333333 | -0.256 |
| 0.8777777777777778 | -0.256 |
| 0.8784722222222222 | -0.256 |
| 0.8791666666666668 | -0.256 |
| 0.8798611111111111 | -0.256 |
| 0.8805555555555555 | -0.256 |
| 0.88125 | -0.256 |
| 0.8819444444444445 | -0.256 |
| 0.8826388888888889 | -0.256 |
| 0.8833333333333333 | -0.256 |
| 0.8840277777777777 | -0.256 |
| 0.8847222222222223 | -0.256 |
| 0.8854166666666666 | -0.256 |
| 0.8861111111111111 | -0.256 |
| 0.8868055555555556 | -0.256 |
| 0.8875000000000001 | -0.256 |
| 0.8881944444444444 | -0.256 |
| 0.8888888888888888 | -0.256 |
| 0.8895833333333334 | -0.256 |
| 0.8902777777777778 | -0.256 |
| 0.8909722222222222 | -0.256 |
| 0.8916666666666666 | -0.256 |
| 0.8923611111111112 | -0.256 |
| 0.8930555555555556 | -0.256 |
| 0.8937499999999999 | -0.256 |
| 0.8944444444444444 | -0.256 |
| 0.8951388888888889 | -0.256 |
| 0.8958333333333334 | -0.256 |
| 0.8965277777777777 | -0.256 |
| 0.8972222222222223 | -0.256 |
| 0.8979166666666667 | -0.256 |
| 0.8986111111111111 | -0.256 |
| 0.8993055555555555 | -0.256 |
| 0.9 | -0.256 |
| 0.9006944444444445 | -0.256 |
| 0.9013888888888889 | -0.256 |
| 0.9020833333333332 | -0.256 |
| 0.9027777777777778 | -0.256 |
| 0.9034722222222222 | -0.256 |
| 0.9041666666666667 | -0.256 |
| 0.904861111111111 | -0.256 |
| 0.9055555555555556 | -0.256 |
| 0.90625 | -0.256 |
| 0.9069444444444444 | -0.256 |
| 0.907638888888889 | -0.256 |
| 0.9083333333333333 | -0.256 |
| 0.9090277777777778 | -0.256 |
| 0.9097222222222222 | -0.256 |
| 0.9104166666666668 | -0.256 |
| 0.9111111111111111 | -0.256 |
| 0.9118055555555555 | -0.256 |
| 0.9125 | -0.256 |
| 0.9131944444444445 | -0.256 |
| 0.9138888888888889 | -0.256 |
| 0.9145833333333333 | -0.256 |
| 0.9152777777777777 | -0.256 |
| 0.9159722222222223 | -0.256 |
| 0.9166666666666666 | -0.256 |
| 0.9173611111111111 | -0.256 |
| 0.9180555555555556 | -0.256 |
| 0.9187500000000001 | -0.256 |
| 0.9194444444444444 | -0.256 |
| 0.9201388888888888 | -0.256 |
| 0.9208333333333334 | -0.256 |
| 0.9215277777777778 | -0.256 |
| 0.9222222222222222 | -0.256 |
| 0.9229166666666666 | -0.256 |
| 0.9236111111111112 | -0.256 |
| 0.9243055555555556 | -0.256 |
| 0.9249999999999999 | -0.256 |
| 0.9256944444444444 | -0.256 |
| 0.9263888888888889 | -0.256 |
| 0.9270833333333334 | -0.256 |
| 0.9277777777777777 | -0.256 |
| 0.9284722222222223 | -0.256 |
| 0.9291666666666667 | -0.256 |
| 0.9298611111111111 | -0.256 |
| 0.9305555555555555 | -0.256 |
| 0.93125 | -0.256 |
| 0.9319444444444445 | -0.256 |
| 0.9326388888888889 | -0.256 |
| 0.9333333333333332 | -0.256 |
| 0.9340277777777778 | -0.256 |
| 0.9347222222222222 | -0.256 |
| 0.9354166666666667 | -0.256 |
| 0.936111111111111 | -0.256 |
| 0.9368055555555556 | -0.256 |
| 0.9375 | -0.256 |
| 0.9381944444444444 | -0.256 |
| 0.938888888888889 | -0.256 |
| 0.9395833333333333 | -0.256 |
| 0.9402777777777778 | -0.256 |
| 0.9409722222222222 | -0.256 |
| 0.9416666666666668 | -0.256 |
| 0.9423611111111111 | -0.256 |
| 0.9430555555555555 | -0.256 |
| 0.94375 | -0.256 |
| 0.9444444444444445 | -0.256 |
| 0.9451388888888889 | -0.256 |
| 0.9458333333333333 | -0.256 |
| 0.9465277777777777 | -0.256 |
| 0.9472222222222223 | -0.256 |
| 0.9479166666666666 | -0.256 |
| 0.9486111111111111 | -0.256 |
| 0.9493055555555556 | -0.256 |
| 0.9500000000000001 | -0.256 |
| 0.9506944444444444 | -0.256 |
| 0.9513888888888888 | -0.256 |
| 0.9520833333333334 | -0.256 |
| 0.9527777777777778 | -0.256 |
| 0.9534722222222222 | -0.256 |
| 0.9541666666666666 | -0.256 |
| 0.9548611111111112 | -0.256 |
| 0.9555555555555556 | -0.256 |
| 0.9562499999999999 | -0.256 |
| 0.9569444444444444 | -0.256 |
| 0.9576388888888889 | -0.256 |
| 0.9583333333333334 | -0.256 |
| 0.9590277777777777 | -0.256 |
| 0.9597222222222223 | -0.256 |
| 0.9604166666666667 | -0.256 |
| 0.9611111111111111 | -0.256 |
| 0.9618055555555555 | -0.256 |
| 0.9625 | -0.256 |
| 0.9631944444444445 | -0.256 |
| 0.9638888888888889 | -0.256 |
| 0.9645833333333332 | -0.256 |
| 0.9652777777777778 | -0.256 |
| 0.9659722222222222 | -0.256 |
| 0.9666666666666667 | -0.256 |
| 0.967361111111111 | -0.256 |
| 0.9680555555555556 | -0.256 |
| 0.96875 | -0.256 |
| 0.9694444444444444 | -0.256 |
| 0.970138888888889 | -0.256 |
| 0.9708333333333333 | -0.256 |
| 0.9715277777777778 | -0.256 |
| 0.9722222222222222 | -0.256 |
| 0.9729166666666668 | -0.256 |
| 0.9736111111111111 | -0.256 |
| 0.9743055555555555 | -0.256 |
| 0.975 | -0.256 |
| 0.9756944444444445 | -0.256 |
| 0.9763888888888889 | -0.256 |
| 0.9770833333333333 | -0.256 |
| 0.9777777777777777 | -0.256 |
| 0.9784722222222223 | -0.256 |
| 0.9791666666666666 | -0.256 |
| 0.9798611111111111 | -0.256 |
| 0.9805555555555556 | -0.256 |
| 0.9812500000000001 | -0.256 |
| 0.9819444444444444 | -0.256 |
| 0.9826388888888888 | -0.256 |
| 0.9833333333333334 | -0.256 |
| 0.9840277777777778 | -0.256 |
| 0.9847222222222222 | -0.256 |
| 0.9854166666666666 | -0.256 |
| 0.9861111111111112 | -0.256 |
| 0.9868055555555556 | -0.256 |
| 0.9874999999999999 | -0.256 |
| 0.9881944444444444 | -0.256 |
| 0.9888888888888889 | -0.256 |
| 0.9895833333333334 | -0.256 |
| 0.9902777777777777 | -0.256 |
| 0.9909722222222223 | -0.256 |
| 0.9916666666666667 | -0.256 |
| 0.9923611111111111 | -0.256 |
| 0.9930555555555555 | -0.256 |
| 0.99375 | -0.256 |
| 0.9944444444444445 | -0.256 |
| 0.9951388888888889 | -0.256 |
| 0.9958333333333332 | -0.256 |
| 0.9965277777777778 | -0.256 |
| 0.9972222222222222 | -0.256 |
| 0.9979166666666667 | -0.256 |
| 0.998611111111111 | -0.256 |
| 0.9993055555555556 | 0 |